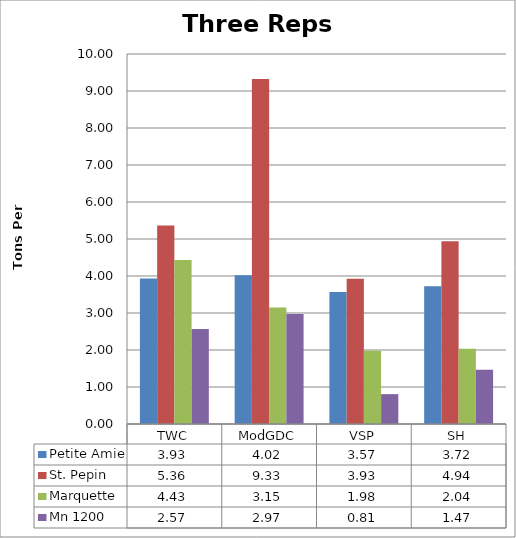
| Category | Petite Amie | St. Pepin | Marquette | Mn 1200 |
|---|---|---|---|---|
| 0 | 3.93 | 5.363 | 4.43 | 2.569 |
| 1 | 4.021 | 9.325 | 3.147 | 2.974 |
| 2 | 3.567 | 3.928 | 1.983 | 0.807 |
| 3 | 3.724 | 4.937 | 2.037 | 1.465 |